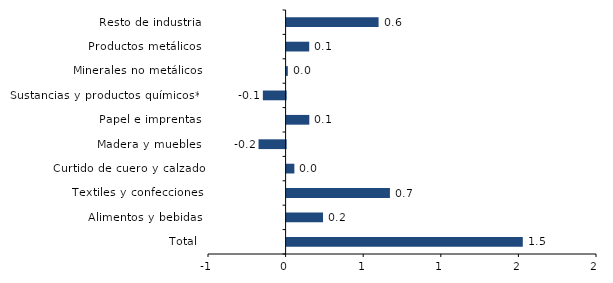
| Category | Series 0 |
|---|---|
| Total | 1.522 |
| Alimentos y bebidas | 0.235 |
| Textiles y confecciones | 0.666 |
| Curtido de cuero y calzado | 0.05 |
| Madera y muebles | -0.174 |
| Papel e imprentas | 0.146 |
| Sustancias y productos químicos** | -0.147 |
| Minerales no metálicos | 0.008 |
| Productos metálicos | 0.146 |
| Resto de industria | 0.593 |